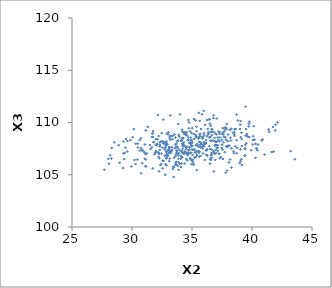
| Category | Series 0 |
|---|---|
| 28.9694215564826 | 106.145 |
| 33.912546418746885 | 107.03 |
| 31.13855683447094 | 106.457 |
| 33.13432144110114 | 108.521 |
| 29.488204101144373 | 108.417 |
| 38.47684160584866 | 107.223 |
| 33.38362021602869 | 108.73 |
| 32.93502604756719 | 107.001 |
| 34.73263915463618 | 107.342 |
| 34.19776321424681 | 107.102 |
| 32.54814188900943 | 106.36 |
| 29.25375239068497 | 105.637 |
| 33.97865848035399 | 106.038 |
| 36.17962580685627 | 107.315 |
| 34.96476857157836 | 108.32 |
| 32.240874607576025 | 107.091 |
| 38.03150408432771 | 107.774 |
| 29.28344094618329 | 107.034 |
| 31.76530088277261 | 109.181 |
| 33.76366719838831 | 108.181 |
| 34.438773446513736 | 107.687 |
| 32.45700743020787 | 107.028 |
| 33.874732220069454 | 106.526 |
| 39.46370931774296 | 108.735 |
| 36.79695905478437 | 110.691 |
| 41.64379335218528 | 107.176 |
| 37.54965923860165 | 107.393 |
| 35.01416879940954 | 108.112 |
| 35.55623526643159 | 107.191 |
| 32.98964902898155 | 106.854 |
| 36.78656196369117 | 109.092 |
| 35.24129200359401 | 107.145 |
| 39.012884891200635 | 109.798 |
| 32.60662131021309 | 110.275 |
| 34.85890263373262 | 107.08 |
| 39.141209291810824 | 108.406 |
| 33.67258464960458 | 107.639 |
| 37.14864443514485 | 107.819 |
| 37.568970990490186 | 109.463 |
| 34.081479248399816 | 105.745 |
| 33.497799239567684 | 106.62 |
| 39.75256275961231 | 109.888 |
| 40.29779536086264 | 107.956 |
| 39.63350838601728 | 108.642 |
| 38.53786005970203 | 109.06 |
| 35.60818539286501 | 107.244 |
| 35.74570175017323 | 109.38 |
| 32.66808484731464 | 107.988 |
| 34.91513855872976 | 106.456 |
| 38.722441755986374 | 108.316 |
| 35.31848626935854 | 107.825 |
| 34.94596110495506 | 106.014 |
| 34.91970815696224 | 107.124 |
| 31.986273265586004 | 108.404 |
| 34.92390305239091 | 107.862 |
| 37.211410110343415 | 109.157 |
| 38.476764153677834 | 107.069 |
| 34.21879095035924 | 107.483 |
| 30.438291086091457 | 106.459 |
| 36.57398009287798 | 109.086 |
| 34.793781248321785 | 107.617 |
| 34.13975411800571 | 107.281 |
| 37.62546308004828 | 108.11 |
| 31.939448896024345 | 107.097 |
| 28.07845047032866 | 106.05 |
| 37.58255784743957 | 109.026 |
| 41.799428037577705 | 107.219 |
| 38.5080646778938 | 108.876 |
| 33.69722653583899 | 107.962 |
| 36.21636346240344 | 107.356 |
| 33.159496406402106 | 108.694 |
| 35.988390449562324 | 108.129 |
| 32.84541296752173 | 107.187 |
| 34.27794676402646 | 107.896 |
| 35.99757709154029 | 107.726 |
| 31.072888242046382 | 107.887 |
| 32.76236904801876 | 105.001 |
| 37.50103256040173 | 107.872 |
| 34.24998402828797 | 108.533 |
| 32.684611716952766 | 108.158 |
| 35.923085018823215 | 108.63 |
| 34.64719589981318 | 106.941 |
| 39.403015763973904 | 106.812 |
| 35.32596922298726 | 108.781 |
| 32.08112590123803 | 107.936 |
| 40.143349877523626 | 109.645 |
| 34.475547442689404 | 107.137 |
| 37.14365120773933 | 108.56 |
| 29.382577200387587 | 107.087 |
| 32.31178534888524 | 108.084 |
| 37.32446331304086 | 109.064 |
| 40.44230033735913 | 107.341 |
| 30.85890159111065 | 106.108 |
| 35.39015363809432 | 109.169 |
| 36.88834982480629 | 106.995 |
| 33.939658845701985 | 108.641 |
| 35.54165777136632 | 107.201 |
| 37.619239129948056 | 108.878 |
| 37.084889922981404 | 107.597 |
| 36.749987242317445 | 108.267 |
| 33.1928732101916 | 110.671 |
| 35.900167460842546 | 107.874 |
| 33.501539688009174 | 105.729 |
| 33.3867510789547 | 108.404 |
| 34.16299165525126 | 108.316 |
| 33.611807653071274 | 107.903 |
| 34.58825838158124 | 108.76 |
| 34.5332802234331 | 107.105 |
| 32.889583885862706 | 106.966 |
| 39.77341794528709 | 110.085 |
| 34.23837258812024 | 107.731 |
| 41.95420570530841 | 109.779 |
| 38.072943614454424 | 106.176 |
| 33.10315989639309 | 107.327 |
| 34.47510363962874 | 108.857 |
| 36.51651497047893 | 107.471 |
| 29.453527030866375 | 107.588 |
| 34.06580598739062 | 106.528 |
| 35.11887892822375 | 107.363 |
| 32.28317680488737 | 106.576 |
| 37.783893199239905 | 109.534 |
| 33.006469043494555 | 108.866 |
| 30.640062039969603 | 108.313 |
| 35.160294663751515 | 110.339 |
| 39.78313921235745 | 108.595 |
| 37.141602886252876 | 107.29 |
| 31.82512428070448 | 108.135 |
| 36.26217971745094 | 107.425 |
| 32.798211843116164 | 107.662 |
| 34.23533054898056 | 107.77 |
| 36.34250894867342 | 108.873 |
| 38.00875624824873 | 108.843 |
| 35.877791920985 | 107.499 |
| 36.36591620048453 | 109.093 |
| 28.31105182708794 | 107.562 |
| 30.742105099652786 | 108.494 |
| 39.44248787959813 | 107.865 |
| 33.46669099345129 | 104.78 |
| 32.800657519263765 | 107.88 |
| 32.35547127667633 | 105.933 |
| 36.18945380388251 | 106.899 |
| 35.3920284006721 | 105.443 |
| 32.09728551035982 | 107.917 |
| 37.83264165853629 | 108.348 |
| 37.7991345946743 | 109.499 |
| 37.76123829634105 | 109.345 |
| 35.32495714226719 | 106.706 |
| 32.1744784165398 | 110.72 |
| 34.872547240708236 | 107.972 |
| 35.00366895978134 | 107.417 |
| 33.61107812042097 | 106.766 |
| 29.288849346636766 | 108.17 |
| 32.2577382228255 | 105.325 |
| 36.981704441615015 | 107.387 |
| 35.3895377721909 | 107.286 |
| 36.311052440251395 | 109.384 |
| 29.61599860714631 | 108.216 |
| 40.87507816824458 | 108.39 |
| 30.205219970620853 | 106.414 |
| 32.55294066762564 | 107.576 |
| 34.5240302494011 | 106.515 |
| 38.202048429341005 | 108.547 |
| 36.64618523478991 | 109.366 |
| 37.254354535012844 | 106.997 |
| 37.91937969091073 | 105.399 |
| 39.15511048078429 | 107.743 |
| 33.566261909466974 | 107.537 |
| 40.09948345681032 | 108.679 |
| 36.62210167456323 | 107.074 |
| 35.02027854241507 | 109.456 |
| 34.25331933089726 | 108.481 |
| 35.66331341829309 | 108.824 |
| 34.77485743728647 | 107.409 |
| 37.778407490985515 | 108.57 |
| 32.21019568664743 | 106.717 |
| 36.507117435100795 | 106.068 |
| 36.25644236692833 | 108.678 |
| 39.58570147090862 | 108.888 |
| 37.3295432493517 | 106.573 |
| 33.848478626001004 | 109.848 |
| 30.155915465754912 | 109.365 |
| 35.7736800550384 | 108.043 |
| 35.53056569110296 | 107.771 |
| 35.35195739190047 | 108.661 |
| 30.482931661980476 | 107.982 |
| 29.863344292341136 | 108.314 |
| 39.03897006609558 | 107.425 |
| 28.025287341953884 | 106.525 |
| 36.440349758996014 | 107.742 |
| 36.56165971948646 | 109.672 |
| 37.06669734297191 | 110.38 |
| 40.38988018325939 | 107.486 |
| 28.283192976203956 | 106.553 |
| 33.40032196394803 | 105.544 |
| 32.84458988022433 | 107.873 |
| 35.70849541692741 | 106.793 |
| 34.514143460654175 | 107.557 |
| 35.85479512226593 | 108.624 |
| 34.122127758459534 | 106.073 |
| 30.05435247378763 | 108.593 |
| 37.730061403470984 | 107.156 |
| 34.71728125100536 | 106.989 |
| 34.61660611823531 | 106.868 |
| 40.07072852033039 | 107.893 |
| 38.238504400574335 | 108.273 |
| 36.64934663358513 | 106.645 |
| 39.04852420689629 | 110.136 |
| 36.11460214419119 | 107.961 |
| 33.62718052483749 | 106.132 |
| 35.8782665160415 | 108.454 |
| 32.8832905421603 | 108.902 |
| 34.83658260998735 | 106.612 |
| 42.10736067950278 | 110.007 |
| 35.04403738246057 | 106.883 |
| 41.433047343098764 | 109.117 |
| 30.859805384309904 | 107.298 |
| 30.850522021144076 | 107.362 |
| 36.940727512602045 | 106.424 |
| 36.97735829340831 | 107.864 |
| 40.08418896765842 | 108.323 |
| 28.532040758571334 | 108.106 |
| 38.54224701517944 | 108.722 |
| 31.229525208939705 | 107.043 |
| 41.38959743575701 | 109.333 |
| 36.47512026215931 | 110.299 |
| 34.59281077074975 | 107.691 |
| 38.81631251067676 | 110.202 |
| 39.53075011004848 | 108.015 |
| 33.02146332842028 | 107.433 |
| 32.437193074278355 | 106.025 |
| 33.62288508066587 | 108.568 |
| 30.75751131690772 | 105.14 |
| 33.233174159811206 | 107.093 |
| 32.856283282443 | 106.6 |
| 31.964587403510805 | 107.107 |
| 31.16358424981523 | 105.802 |
| 31.54319078480918 | 107.459 |
| 33.75542731694722 | 107.714 |
| 36.16971995712731 | 108.299 |
| 31.06841743871491 | 106.534 |
| 34.920876940411574 | 108.303 |
| 33.855819739333846 | 106.835 |
| 31.696254372599906 | 108.929 |
| 32.123083384039596 | 108.394 |
| 34.68601908302138 | 108.363 |
| 37.928108485198536 | 107.728 |
| 31.997596615299017 | 107.262 |
| 32.60689010529521 | 108.022 |
| 36.547747228899006 | 108.632 |
| 36.08259923155677 | 107.952 |
| 33.33684538241521 | 107.376 |
| 36.95071847185798 | 108.945 |
| 34.36819829862434 | 108.884 |
| 36.62490399245535 | 106.907 |
| 31.863721642318747 | 106.957 |
| 37.81370463240455 | 105.205 |
| 32.7655610576445 | 107.594 |
| 32.47504092311147 | 108.987 |
| 38.27573049133581 | 109.404 |
| 29.956540512924068 | 105.799 |
| 35.10935216374469 | 106.05 |
| 34.27197652534143 | 107.081 |
| 35.9144837399479 | 107.036 |
| 34.07504780126719 | 106.804 |
| 33.09248141407814 | 107.646 |
| 32.00468705724755 | 107.885 |
| 34.7462152697084 | 110.007 |
| 35.4144306910497 | 107.926 |
| 34.921053245961694 | 107.715 |
| 37.01640369559594 | 107.076 |
| 31.77746398881736 | 108.109 |
| 35.17960889277685 | 108.896 |
| 29.599192897121988 | 107.228 |
| 34.00975340429614 | 110.788 |
| 35.41696797035374 | 106.889 |
| 38.09968028179963 | 107.786 |
| 36.81134301212161 | 105.312 |
| 36.65618977303513 | 107.4 |
| 27.693592835451945 | 105.482 |
| 34.32411664971587 | 108.085 |
| 36.66180238169008 | 109.329 |
| 32.92472915010085 | 106.731 |
| 33.89936119528405 | 106.191 |
| 34.46150704458517 | 108.918 |
| 36.08710146539932 | 109.775 |
| 32.74165061952153 | 107.415 |
| 32.32735142623879 | 107.842 |
| 34.39548350589864 | 106.069 |
| 35.688494476063305 | 107.908 |
| 31.312969593438204 | 109.578 |
| 33.692264837870404 | 106.227 |
| 34.18022864545287 | 106.683 |
| 36.91279588912951 | 107.777 |
| 34.28858523686854 | 109.062 |
| 32.95497198443951 | 107.918 |
| 33.00331569667682 | 109.015 |
| 33.74462459989752 | 107.261 |
| 35.85209599990915 | 107.682 |
| 34.09187532666807 | 107.249 |
| 35.721065705761625 | 107.897 |
| 33.76049246291896 | 107.039 |
| 32.836108576111776 | 108.044 |
| 36.06722395867062 | 107.956 |
| 35.963727214421176 | 107.75 |
| 37.066468686890055 | 108.161 |
| 37.893871809047205 | 109.858 |
| 37.889269496714086 | 109.357 |
| 34.7783836379946 | 108.029 |
| 33.10329240128096 | 106.299 |
| 34.65550142172933 | 108.307 |
| 33.620668235573454 | 105.927 |
| 32.96483746048065 | 106.87 |
| 34.97730938421862 | 108.968 |
| 37.19930158591997 | 108.308 |
| 36.056715716640184 | 106.415 |
| 35.20412580066844 | 107.436 |
| 41.93460687942748 | 109.251 |
| 38.716060564601634 | 107.057 |
| 33.706309399353636 | 107.328 |
| 40.49598314865283 | 107.887 |
| 36.4968811382444 | 109.879 |
| 38.61921993575596 | 107.73 |
| 35.973018768669284 | 111.109 |
| 32.32873710630844 | 107.701 |
| 32.90932453459871 | 107.257 |
| 36.17719451925978 | 108.038 |
| 38.54529394982397 | 109.348 |
| 36.87761639344539 | 108.526 |
| 36.436152995903285 | 110.301 |
| 34.83970737534977 | 106.588 |
| 39.10765478326767 | 106.477 |
| 34.698180210474696 | 108.556 |
| 34.82529724571947 | 108.099 |
| 39.91885227265202 | 107.345 |
| 39.4290133766724 | 106.848 |
| 33.15173961561602 | 107.581 |
| 37.588758475362766 | 106.508 |
| 30.295076220504313 | 106.028 |
| 37.03188182877073 | 108.866 |
| 35.59304073531819 | 106.732 |
| 38.98584166759221 | 109.378 |
| 35.21077278530484 | 106.636 |
| 33.88171740137207 | 105.468 |
| 35.67886904516591 | 107.619 |
| 35.020916871121514 | 106.408 |
| 35.831074647560754 | 110.79 |
| 34.84478334377813 | 109.137 |
| 37.32405554962737 | 108.572 |
| 35.05862817049334 | 106.264 |
| 33.67570307732715 | 106.95 |
| 32.7285043196518 | 106.82 |
| 34.55920483961523 | 109.063 |
| 36.63336941039439 | 108.254 |
| 33.82923874278868 | 107.574 |
| 33.941069612613454 | 107.374 |
| 33.31656303397218 | 107.29 |
| 32.85604789069711 | 106.57 |
| 34.52015197992344 | 107.45 |
| 35.80872156425231 | 107.649 |
| 34.19770231060113 | 109.154 |
| 35.51111635106712 | 107.696 |
| 35.6098478770686 | 108.128 |
| 33.322366243437024 | 107.636 |
| 28.17572799667155 | 106.859 |
| 37.48006098434247 | 107.561 |
| 31.507605693520063 | 107.846 |
| 35.327906731129865 | 107.121 |
| 38.64557696004787 | 109.377 |
| 33.03821952536423 | 109.054 |
| 35.187980839735296 | 108.437 |
| 36.51246541313023 | 106.475 |
| 36.5723139374835 | 106.601 |
| 32.035486774868254 | 107.815 |
| 33.143516205417164 | 106.541 |
| 35.63017998614151 | 108.639 |
| 31.651901077861996 | 108.617 |
| 31.156597427654738 | 109.242 |
| 37.489324254526096 | 108.341 |
| 39.121045723139474 | 109.027 |
| 38.72201528150519 | 110.758 |
| 33.20181864122834 | 108.346 |
| 35.6310172427722 | 108.154 |
| 33.892166232462614 | 108.809 |
| 31.131944047539697 | 106.977 |
| 32.24120658960934 | 106.988 |
| 34.890678780095946 | 108.555 |
| 35.37689128559209 | 109.594 |
| 36.79244894392715 | 109.101 |
| 33.075560336068946 | 107.093 |
| 33.80885302305518 | 105.851 |
| 37.09334731272186 | 107.828 |
| 34.18057464715512 | 109.305 |
| 34.69523938483804 | 107.143 |
| 36.37452545775891 | 108.905 |
| 35.52412491266884 | 108.478 |
| 34.27751457742096 | 107.847 |
| 36.66358757045052 | 108.817 |
| 36.88041298399412 | 108.232 |
| 36.584684968159834 | 106.884 |
| 28.890965429304238 | 107.825 |
| 31.6602561981464 | 107.614 |
| 34.34089665712332 | 106.978 |
| 35.57909827331738 | 110.928 |
| 39.464662587043335 | 111.512 |
| 34.619058217563676 | 107.009 |
| 35.2959377087995 | 110.191 |
| 40.81626252446169 | 108.289 |
| 40.20792580421744 | 108.365 |
| 33.16316830414934 | 107.257 |
| 32.8020257120439 | 106 |
| 36.523593882454634 | 108.27 |
| 32.86248340190934 | 105.887 |
| 39.72433513898504 | 109.631 |
| 37.31357372613111 | 108.194 |
| 34.97005632992237 | 108.008 |
| 29.347827419162268 | 106.498 |
| 31.72516597986426 | 105.61 |
| 35.58582250684998 | 107.104 |
| 35.68348694390908 | 108.919 |
| 35.34790323776772 | 108.614 |
| 38.281718096994055 | 107.529 |
| 35.999495975998244 | 108.973 |
| 33.74071951687575 | 107.121 |
| 33.258707092918904 | 108.675 |
| 32.555436990527674 | 105.62 |
| 32.31010188239666 | 107.376 |
| 37.29282086827548 | 108.919 |
| 37.65269441908418 | 108.643 |
| 31.118566745937024 | 105.818 |
| 38.170416537672146 | 109.292 |
| 37.68672946552672 | 109.145 |
| 39.558242239283146 | 108.772 |
| 30.908903323257018 | 107.305 |
| 33.694160436342216 | 105.992 |
| 34.73753689323607 | 109.453 |
| 36.25981276784565 | 110.237 |
| 32.86936384950495 | 107.839 |
| 34.205425374868256 | 107.99 |
| 32.888692292997824 | 108.169 |
| 30.30671585572702 | 107.959 |
| 36.78754351605234 | 110.422 |
| 38.419997028836946 | 109.028 |
| 34.7010865514833 | 110.247 |
| 38.98118248045726 | 106.101 |
| 37.53956802632824 | 108.884 |
| 34.37519838080562 | 109.095 |
| 38.77335344910391 | 107.573 |
| 32.62001995577824 | 106.317 |
| 34.393917969044914 | 107.238 |
| 34.59738993224107 | 106.375 |
| 43.22577174072552 | 107.257 |
| 37.26602514581933 | 107.027 |
| 30.75846595464943 | 107.543 |
| 39.42105888779835 | 107.46 |
| 36.807890573709855 | 107.251 |
| 36.28145336617479 | 106.827 |
| 30.484568931165764 | 107.615 |
| 36.581088698538636 | 106.422 |
| 34.146322346958826 | 108.468 |
| 36.82312001840806 | 107.135 |
| 36.007900041344676 | 108.771 |
| 37.9910588027411 | 108.207 |
| 39.02813631372548 | 106.284 |
| 31.720886074833167 | 108.98 |
| 40.295920477715306 | 106.62 |
| 41.04780918118278 | 106.934 |
| 35.03837387995854 | 107.759 |
| 43.57507158335254 | 106.483 |
| 39.05572763940025 | 108.594 |
| 34.29849714842077 | 107.796 |
| 39.162376380115816 | 105.917 |
| 33.18761889655022 | 107.117 |
| 35.6189680205547 | 108.531 |
| 31.02999696435807 | 107.14 |
| 35.04271094163075 | 106.432 |
| 38.28307863892488 | 105.683 |
| 36.98870403330597 | 108.129 |
| 35.642480746961574 | 110.153 |
| 37.85718534771831 | 107.742 |
| 31.755318587864057 | 108.597 |
| 35.131186068534376 | 105.952 |
| 32.43297113189055 | 108.186 |
| 40.36660870442258 | 107.534 |
| 36.46070034087348 | 108.568 |
| 39.42562009479238 | 107.522 |
| 33.54262511781564 | 108.866 |
| 37.925199819950514 | 107.644 |
| 32.17749514015675 | 107.15 |
| 41.74304740510076 | 109.566 |
| 34.082591973712134 | 108.223 |
| 30.654253898757677 | 107.32 |
| 32.220716413891495 | 108.7 |
| 32.51588578642039 | 108.196 |
| 38.178248926241665 | 106.462 |
| 39.49928168006861 | 109.367 |
| 33.41570449087474 | 105.763 |
| 37.12888476747788 | 107.55 |
| 34.20787734872898 | 107.948 |
| 33.84402432265052 | 108.281 |
| 37.397070010851785 | 106.696 |